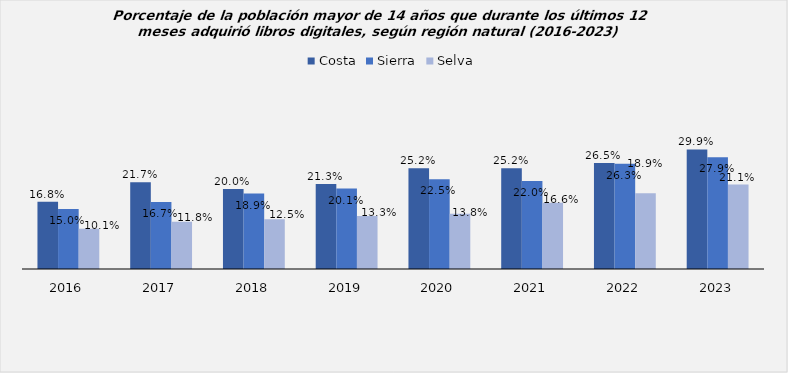
| Category | Costa | Sierra | Selva |
|---|---|---|---|
| 2016.0 | 0.168 | 0.15 | 0.101 |
| 2017.0 | 0.217 | 0.167 | 0.118 |
| 2018.0 | 0.2 | 0.189 | 0.124 |
| 2019.0 | 0.212 | 0.201 | 0.133 |
| 2020.0 | 0.252 | 0.224 | 0.138 |
| 2021.0 | 0.252 | 0.22 | 0.166 |
| 2022.0 | 0.265 | 0.263 | 0.189 |
| 2023.0 | 0.299 | 0.279 | 0.211 |